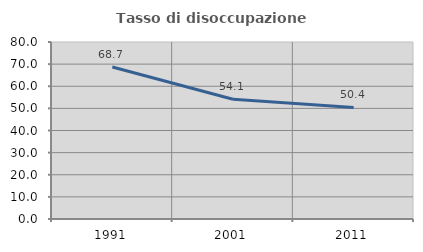
| Category | Tasso di disoccupazione giovanile  |
|---|---|
| 1991.0 | 68.731 |
| 2001.0 | 54.098 |
| 2011.0 | 50.433 |